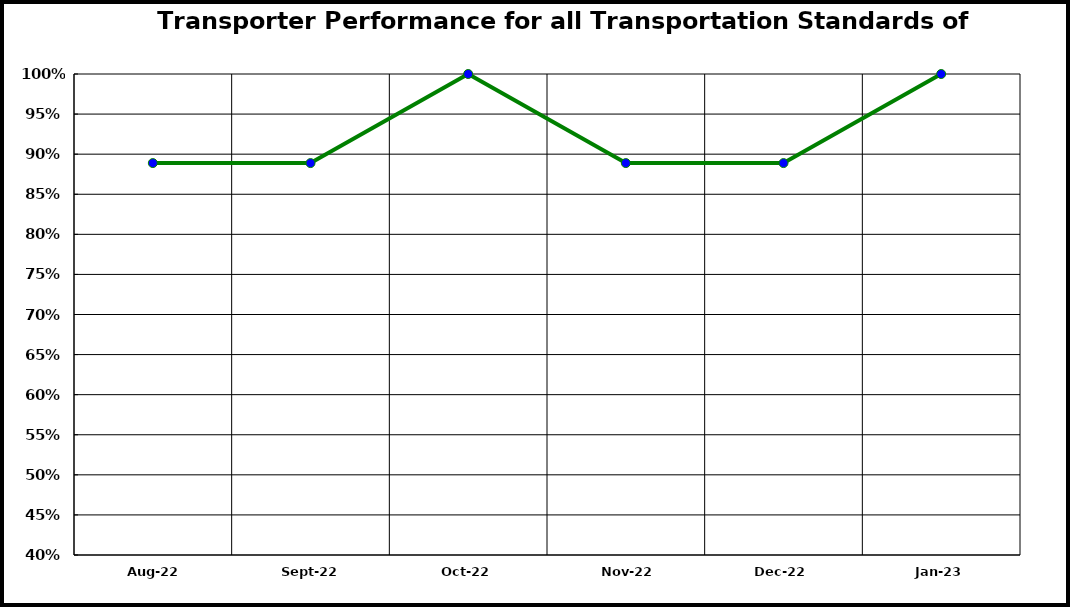
| Category | Performance |
|---|---|
| 2022-08-01 | 0.889 |
| 2022-09-01 | 0.889 |
| 2022-10-01 | 1 |
| 2022-11-01 | 0.889 |
| 2022-12-01 | 0.889 |
| 2023-01-01 | 1 |